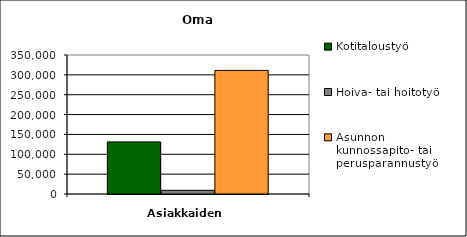
| Category | Kotitaloustyö | Hoiva- tai hoitotyö | Asunnon kunnossapito- tai perusparannustyö |
|---|---|---|---|
| 0 | 131187 | 9298 | 311245 |